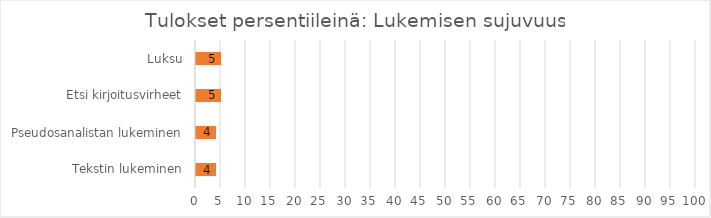
| Category | Tulokset persentiileinä: Lukemisen sujuvuus |
|---|---|
| Luksu | 5 |
| Etsi kirjoitusvirheet | 5 |
| Pseudosanalistan lukeminen | 4 |
| Tekstin lukeminen | 4 |